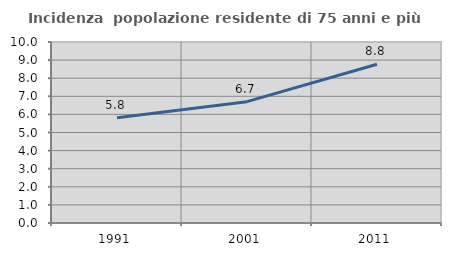
| Category | Incidenza  popolazione residente di 75 anni e più |
|---|---|
| 1991.0 | 5.816 |
| 2001.0 | 6.703 |
| 2011.0 | 8.774 |